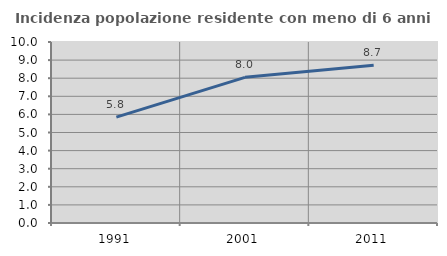
| Category | Incidenza popolazione residente con meno di 6 anni |
|---|---|
| 1991.0 | 5.848 |
| 2001.0 | 8.048 |
| 2011.0 | 8.715 |